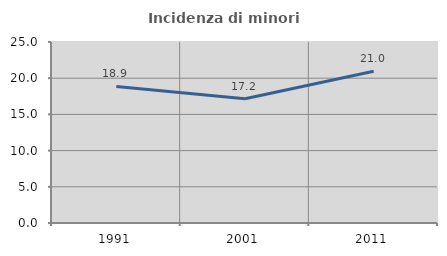
| Category | Incidenza di minori stranieri |
|---|---|
| 1991.0 | 18.868 |
| 2001.0 | 17.172 |
| 2011.0 | 20.954 |